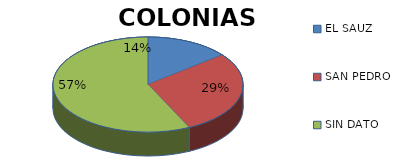
| Category | COLONIA |
|---|---|
| EL SAUZ | 1 |
| SAN PEDRO | 2 |
| SIN DATO | 4 |